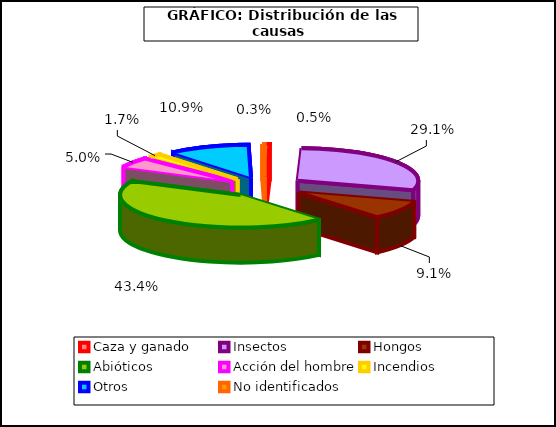
| Category | Series 0 |
|---|---|
| Caza y ganado | 25 |
| Insectos | 1388 |
| Hongos  | 432 |
| Abióticos | 2068 |
| Acción del hombre | 238 |
| Incendios | 80 |
| Otros | 517 |
| No identificados | 15 |